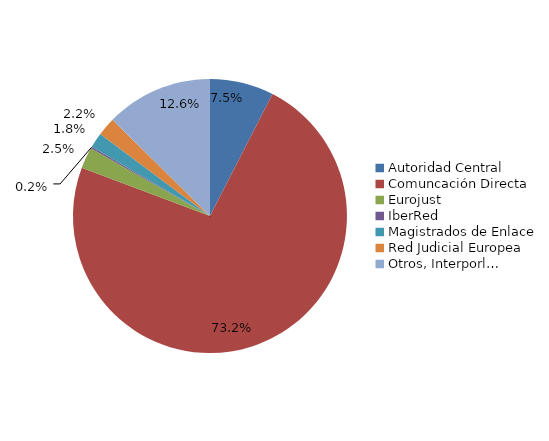
| Category | Series 0 |
|---|---|
| Autoridad Central | 353 |
| Comuncación Directa | 3424 |
| Eurojust | 117 |
| IberRed | 10 |
| Magistrados de Enlace | 83 |
| Red Judicial Europea | 102 |
| Otros, Interporl… | 590 |